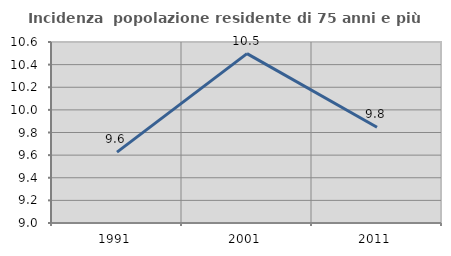
| Category | Incidenza  popolazione residente di 75 anni e più |
|---|---|
| 1991.0 | 9.627 |
| 2001.0 | 10.498 |
| 2011.0 | 9.847 |